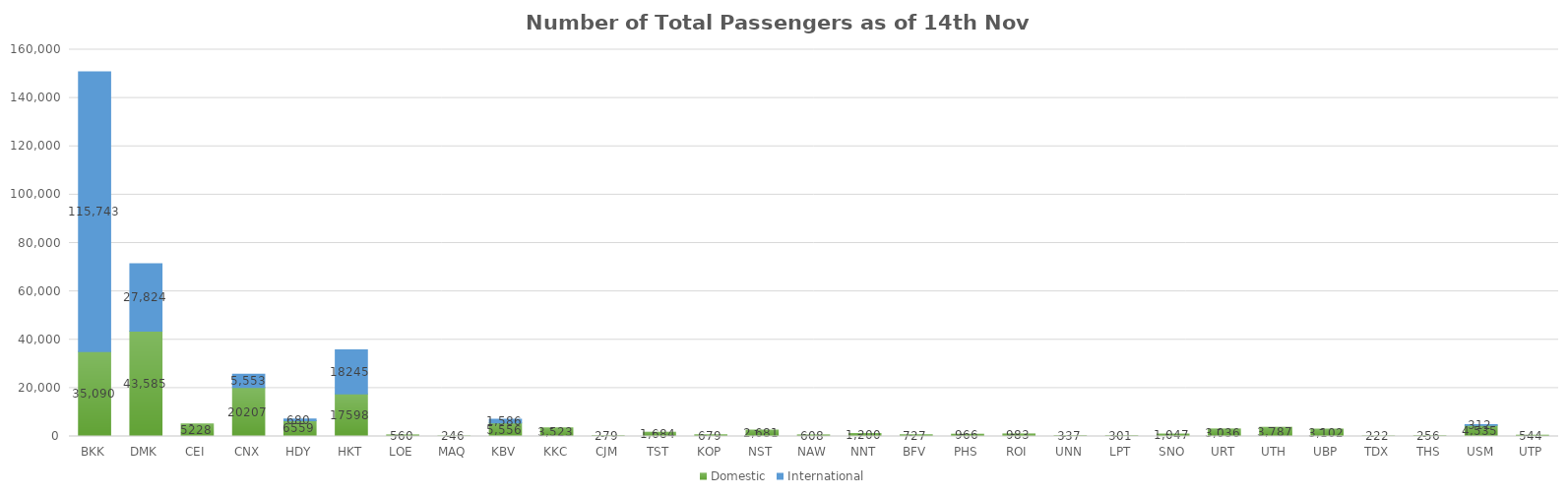
| Category | Domestic | International |
|---|---|---|
| BKK | 35090 | 115743 |
| DMK | 43585 | 27824 |
| CEI | 5228 | 0 |
| CNX | 20207 | 5553 |
| HDY | 6559 | 680 |
| HKT | 17598 | 18245 |
| LOE | 560 | 0 |
| MAQ | 246 | 0 |
| KBV | 5556 | 1586 |
| KKC | 3523 | 0 |
| CJM | 279 | 0 |
| TST | 1684 | 0 |
| KOP | 679 | 0 |
| NST | 2681 | 0 |
| NAW | 608 | 0 |
| NNT | 1200 | 0 |
| BFV | 727 | 0 |
| PHS | 966 | 0 |
| ROI | 983 | 0 |
| UNN | 337 | 0 |
| LPT | 301 | 0 |
| SNO | 1047 | 0 |
| URT | 3036 | 0 |
| UTH | 3787 | 0 |
| UBP | 3102 | 0 |
| TDX | 222 | 0 |
| THS | 256 | 0 |
| USM | 4535 | 312 |
| UTP | 544 | 0 |